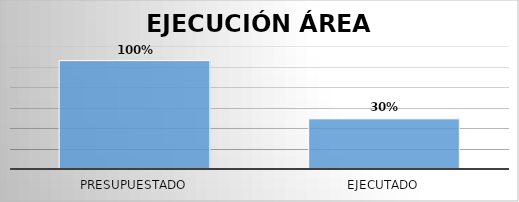
| Category | Series 0 |
|---|---|
| Presupuestado | 26438745722 |
| Ejecutado | 12237901715 |